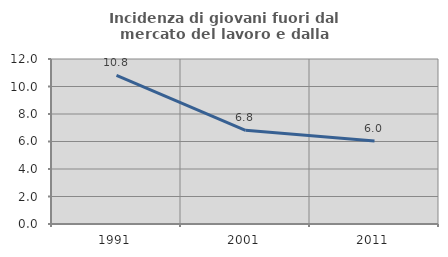
| Category | Incidenza di giovani fuori dal mercato del lavoro e dalla formazione  |
|---|---|
| 1991.0 | 10.811 |
| 2001.0 | 6.81 |
| 2011.0 | 6.031 |